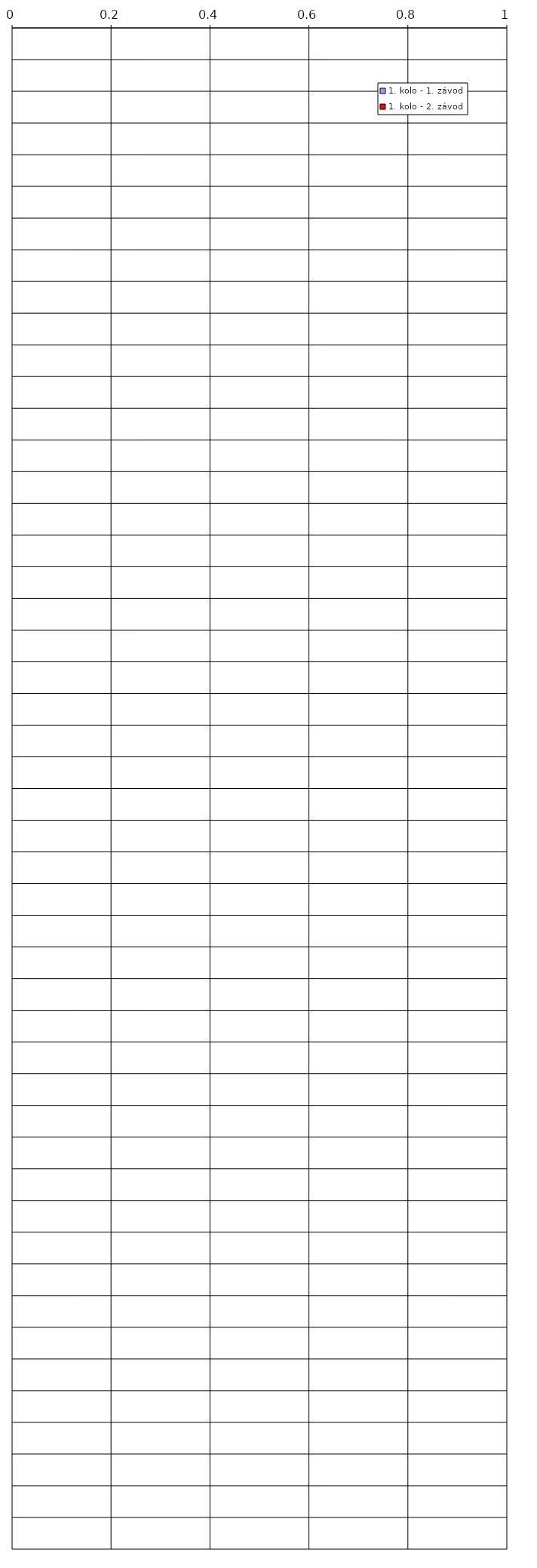
| Category | 1. kolo - 1. závod | 1. kolo - 2. závod |
|---|---|---|
| 0 | 0 | 0 |
| 1 | 0 | 0 |
| 2 | 0 | 0 |
| 3 | 0 | 0 |
| 4 | 0 | 0 |
| 5 | 0 | 0 |
| 6 | 0 | 0 |
| 7 | 0 | 0 |
| 8 | 0 | 0 |
| 9 | 0 | 0 |
| 10 | 0 | 0 |
| 11 | 0 | 0 |
| 12 | 0 | 0 |
| 13 | 0 | 0 |
| 14 | 0 | 0 |
| 15 | 0 | 0 |
| 16 | 0 | 0 |
| 17 | 0 | 0 |
| 18 | 0 | 0 |
| 19 | 0 | 0 |
| 20 | 0 | 0 |
| 21 | 0 | 0 |
| 22 | 0 | 0 |
| 23 | 0 | 0 |
| 24 | 0 | 0 |
| 25 | 0 | 0 |
| 26 | 0 | 0 |
| 27 | 0 | 0 |
| 28 | 0 | 0 |
| 29 | 0 | 0 |
| 30 | 0 | 0 |
| 31 | 0 | 0 |
| 32 | 0 | 0 |
| 33 | 0 | 0 |
| 34 | 0 | 0 |
| 35 | 0 | 0 |
| 36 | 0 | 0 |
| 37 | 0 | 0 |
| 38 | 0 | 0 |
| 39 | 0 | 0 |
| 40 | 0 | 0 |
| 41 | 0 | 0 |
| 42 | 0 | 0 |
| 43 | 0 | 0 |
| 44 | 0 | 0 |
| 45 | 0 | 0 |
| 46 | 0 | 0 |
| 47 | 0 | 0 |